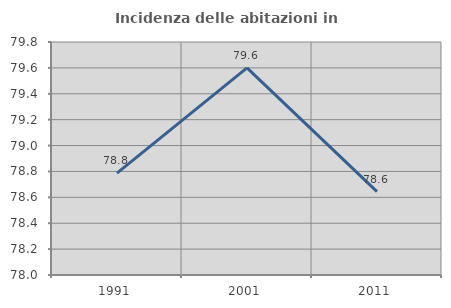
| Category | Incidenza delle abitazioni in proprietà  |
|---|---|
| 1991.0 | 78.786 |
| 2001.0 | 79.601 |
| 2011.0 | 78.644 |